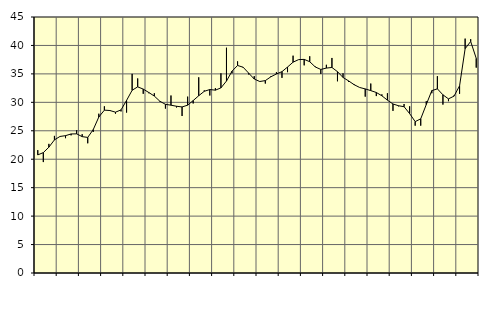
| Category | Piggar | Series 1 |
|---|---|---|
| nan | 21.6 | 20.76 |
| 1.0 | 19.5 | 21.16 |
| 1.0 | 22.7 | 22.12 |
| 1.0 | 24.1 | 23.4 |
| nan | 24 | 24 |
| 2.0 | 23.7 | 24.14 |
| 2.0 | 24.2 | 24.44 |
| 2.0 | 25.1 | 24.46 |
| nan | 24.4 | 23.97 |
| 3.0 | 22.8 | 23.83 |
| 3.0 | 24.8 | 25.22 |
| 3.0 | 28 | 27.42 |
| nan | 29.3 | 28.63 |
| 4.0 | 28.5 | 28.56 |
| 4.0 | 28 | 28.27 |
| 4.0 | 28.4 | 28.67 |
| nan | 28.2 | 30.34 |
| 5.0 | 35 | 32.12 |
| 5.0 | 34.2 | 32.72 |
| 5.0 | 31.5 | 32.33 |
| nan | 31.6 | 31.73 |
| 6.0 | 31.6 | 31.1 |
| 6.0 | 30.1 | 30.19 |
| 6.0 | 28.9 | 29.65 |
| nan | 31.2 | 29.5 |
| 7.0 | 29.1 | 29.31 |
| 7.0 | 27.6 | 29.19 |
| 7.0 | 31 | 29.5 |
| nan | 29.8 | 30.31 |
| 8.0 | 34.4 | 31.16 |
| 8.0 | 32.1 | 31.94 |
| 8.0 | 31.2 | 32.25 |
| nan | 32.5 | 32.14 |
| 9.0 | 35.1 | 32.54 |
| 9.0 | 39.6 | 33.74 |
| 9.0 | 35.1 | 35.48 |
| nan | 37.2 | 36.48 |
| 10.0 | 36.1 | 36.17 |
| 10.0 | 34.9 | 35.13 |
| 10.0 | 34.6 | 34.1 |
| nan | 33.7 | 33.66 |
| 11.0 | 33.3 | 33.82 |
| 11.0 | 34.6 | 34.49 |
| 11.0 | 35.3 | 34.99 |
| nan | 34.3 | 35.39 |
| 12.0 | 35.3 | 36.2 |
| 12.0 | 38.2 | 37.06 |
| 12.0 | 37.5 | 37.51 |
| nan | 36.5 | 37.55 |
| 13.0 | 38.1 | 37.14 |
| 13.0 | 36.3 | 36.22 |
| 13.0 | 35 | 35.78 |
| nan | 36.6 | 36.02 |
| 14.0 | 37.8 | 36.13 |
| 14.0 | 33.7 | 35.39 |
| 14.0 | 35.1 | 34.37 |
| nan | 33.6 | 33.77 |
| 15.0 | 33.2 | 33.1 |
| 15.0 | 32.6 | 32.61 |
| 15.0 | 31 | 32.36 |
| nan | 33.3 | 32.06 |
| 16.0 | 31.1 | 31.73 |
| 16.0 | 31.4 | 31.15 |
| 16.0 | 31.6 | 30.38 |
| nan | 28.5 | 29.71 |
| 17.0 | 29.3 | 29.4 |
| 17.0 | 29.7 | 29.23 |
| 17.0 | 29.3 | 28.02 |
| nan | 25.9 | 26.61 |
| 18.0 | 25.9 | 27.1 |
| 18.0 | 30.2 | 29.61 |
| 18.0 | 31.6 | 32.06 |
| nan | 34.6 | 32.37 |
| 19.0 | 29.6 | 31.32 |
| 19.0 | 30.2 | 30.61 |
| 19.0 | 31.2 | 31.09 |
| nan | 31.5 | 32.9 |
| 20.0 | 41.2 | 39.43 |
| 20.0 | 41.1 | 40.7 |
| 20.0 | 36.1 | 37.74 |